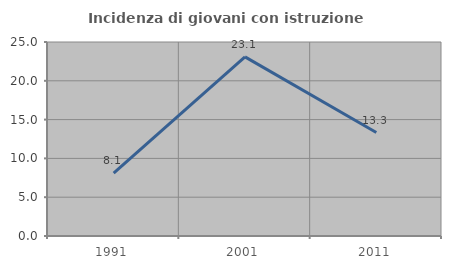
| Category | Incidenza di giovani con istruzione universitaria |
|---|---|
| 1991.0 | 8.108 |
| 2001.0 | 23.077 |
| 2011.0 | 13.333 |